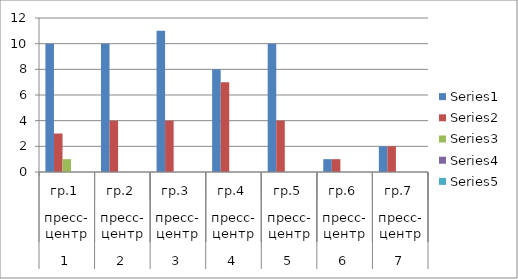
| Category | Series 0 | Series 1 | Series 2 | Series 3 | Series 4 |
|---|---|---|---|---|---|
| 0 | 10 | 3 | 1 | 0 | 0 |
| 1 | 10 | 4 | 0 | 0 | 0 |
| 2 | 11 | 4 | 0 | 0 | 0 |
| 3 | 8 | 7 | 0 | 0 | 0 |
| 4 | 10 | 4 | 0 | 0 | 0 |
| 5 | 1 | 1 | 0 | 0 | 0 |
| 6 | 2 | 2 | 0 | 0 | 0 |